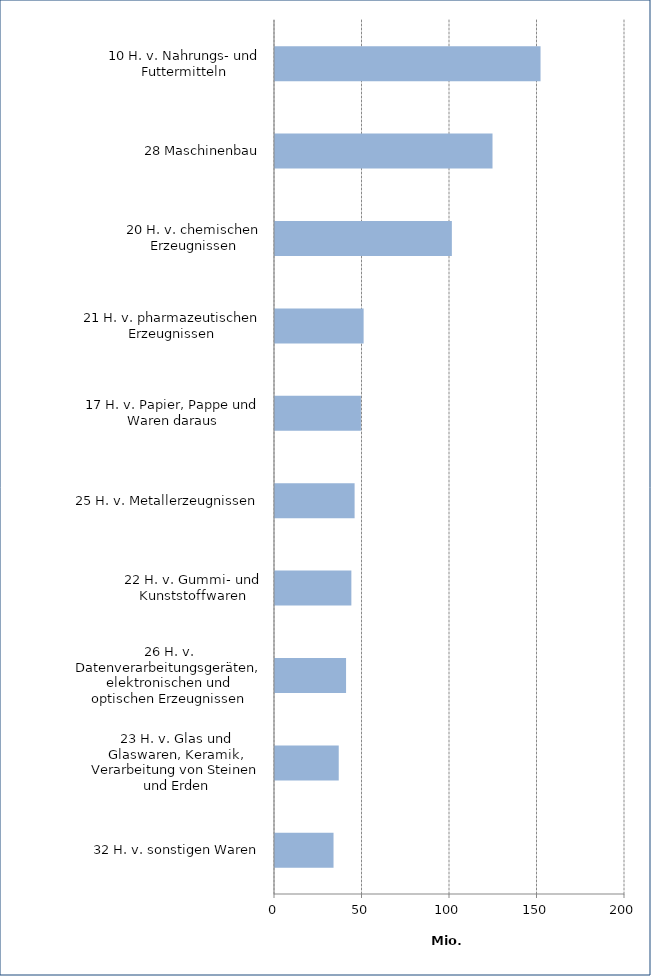
| Category | Mio. Euro |
|---|---|
| 32 H. v. sonstigen Waren | 33.443 |
| 23 H. v. Glas und Glaswaren, Keramik, Verarbeitung von Steinen und Erden | 36.424 |
| 26 H. v. Datenverarbeitungsgeräten, elektronischen und optischen Erzeugnissen | 40.606 |
| 22 H. v. Gummi- und Kunststoffwaren | 43.636 |
| 25 H. v. Metallerzeugnissen | 45.488 |
| 17 H. v. Papier, Pappe und Waren daraus | 49.094 |
| 21 H. v. pharmazeutischen Erzeugnissen | 50.64 |
| 20 H. v. chemischen Erzeugnissen | 101.061 |
| 28 Maschinenbau | 124.291 |
| 10 H. v. Nahrungs- und Futtermitteln | 151.733 |